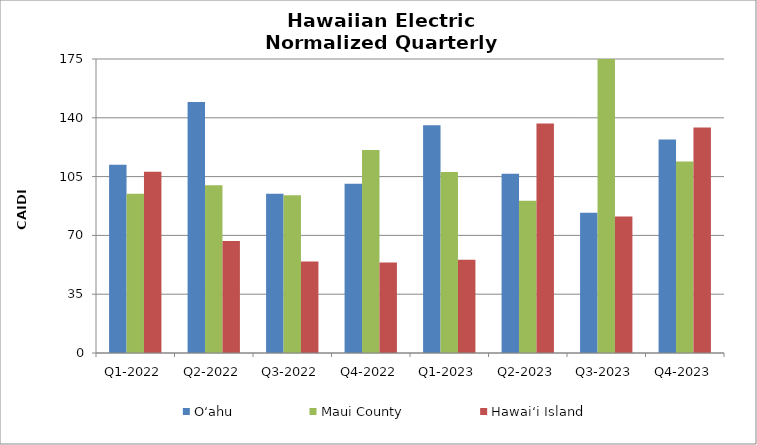
| Category | O‘ahu | Maui County | Hawai‘i Island |
|---|---|---|---|
| Q1-2022 | 112.062 | 94.779 | 107.909 |
| Q2-2022 | 149.443 | 99.907 | 66.604 |
| Q3-2022 | 94.719 | 93.956 | 54.39 |
| Q4-2022 | 100.768 | 120.88 | 53.81 |
| Q1-2023 | 135.574 | 107.711 | 55.509 |
| Q2-2023 | 106.678 | 90.562 | 136.569 |
| Q3-2023 | 83.424 | 209.025 | 81.242 |
| Q4-2023 | 127.113 | 114.051 | 134.16 |